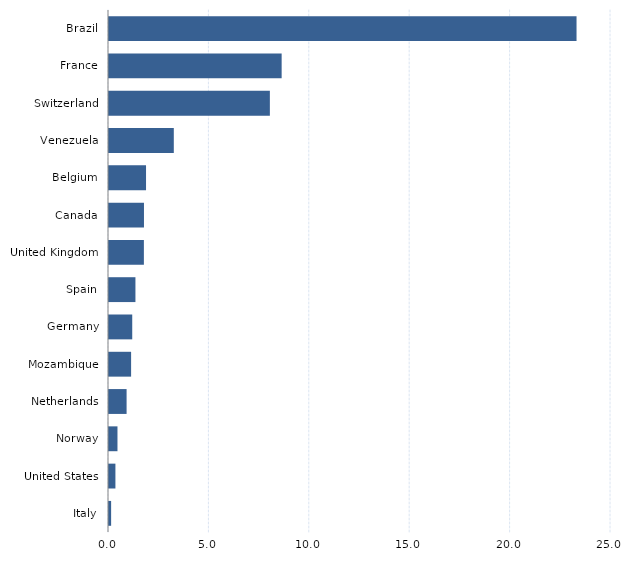
| Category | Series 0 |
|---|---|
| Italy | 0.106 |
| United States | 0.32 |
| Norway | 0.422 |
| Netherlands | 0.876 |
| Mozambique | 1.101 |
| Germany | 1.157 |
| Spain | 1.317 |
| United Kingdom | 1.737 |
| Canada | 1.742 |
| Belgium | 1.844 |
| Venezuela | 3.227 |
| Switzerland | 8.011 |
| France | 8.598 |
| Brazil | 23.284 |